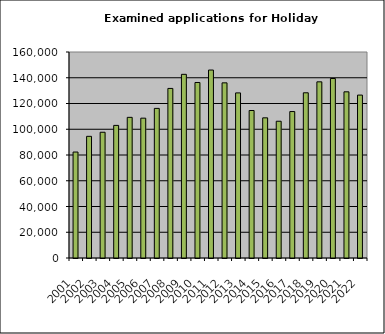
| Category | Series 1 |
|---|---|
| 2001.0 | 82300 |
| 2002.0 | 94495 |
| 2003.0 | 97668 |
| 2004.0 | 102993 |
| 2005.0 | 109246 |
| 2006.0 | 108610 |
| 2007.0 | 116196 |
| 2008.0 | 131709 |
| 2009.0 | 142650 |
| 2010.0 | 136317 |
| 2011.0 | 145992 |
| 2012.0 | 136034 |
| 2013.0 | 128233 |
| 2014.0 | 114556 |
| 2015.0 | 108860 |
| 2016.0 | 106220 |
| 2017.0 | 113748 |
| 2018.0 | 128324 |
| 2019.0 | 136828 |
| 2020.0 | 139426 |
| 2021.0 | 129071 |
| 2022.0 | 126541 |